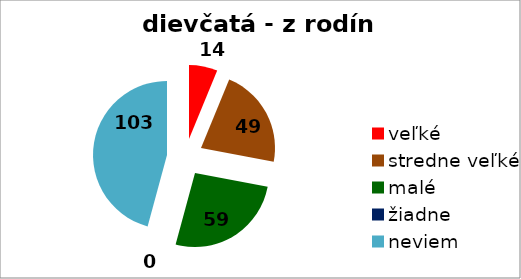
| Category | dievčatá |
|---|---|
| veľké | 14 |
| stredne veľké | 49 |
| malé | 59 |
| žiadne | 0 |
| neviem | 103 |